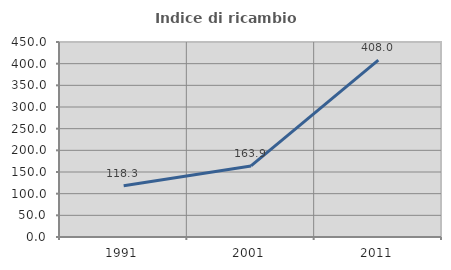
| Category | Indice di ricambio occupazionale  |
|---|---|
| 1991.0 | 118.31 |
| 2001.0 | 163.934 |
| 2011.0 | 408 |